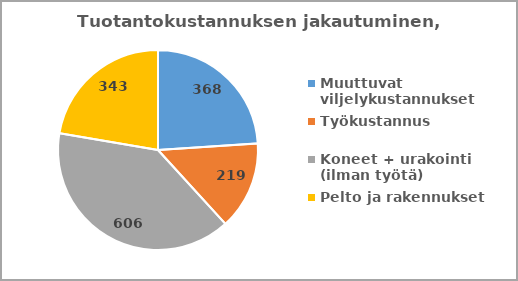
| Category | Series 0 |
|---|---|
| Muuttuvat viljelykustannukset | 367.967 |
| Työkustannus | 219.36 |
| Koneet + urakointi (ilman työtä) | 606.406 |
| Pelto ja rakennukset | 342.8 |